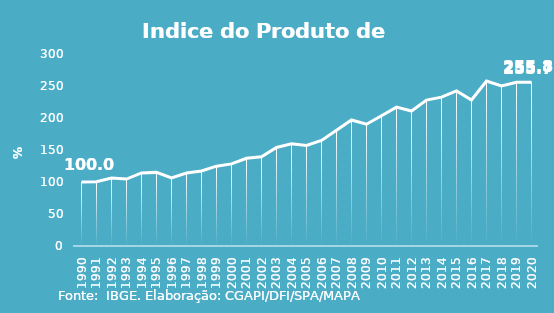
| Category | Indice de Prod. base 1990 |
|---|---|
| 1990.0 | 100 |
| 1991.0 | 100.275 |
| 1992.0 | 106.203 |
| 1993.0 | 104.57 |
| 1994.0 | 114.164 |
| 1995.0 | 115.024 |
| 1996.0 | 106.552 |
| 1997.0 | 114.037 |
| 1998.0 | 117.319 |
| 1999.0 | 124.734 |
| 2000.0 | 128.293 |
| 2001.0 | 136.975 |
| 2002.0 | 139.51 |
| 2003.0 | 153.868 |
| 2004.0 | 159.641 |
| 2005.0 | 157.136 |
| 2006.0 | 164.858 |
| 2007.0 | 180.781 |
| 2008.0 | 196.91 |
| 2009.0 | 190.309 |
| 2010.0 | 203.581 |
| 2011.0 | 217.041 |
| 2012.0 | 210.932 |
| 2013.0 | 228.009 |
| 2014.0 | 232.562 |
| 2015.0 | 242.318 |
| 2016.0 | 228.239 |
| 2017.0 | 257.766 |
| 2018.0 | 250.124 |
| 2019.0 | 255.721 |
| 2020.0 | 255.817 |